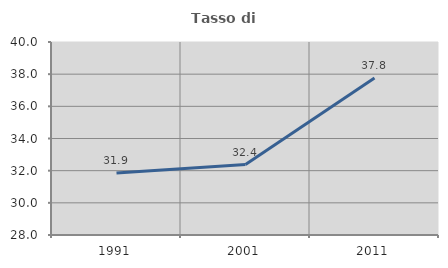
| Category | Tasso di occupazione   |
|---|---|
| 1991.0 | 31.86 |
| 2001.0 | 32.381 |
| 2011.0 | 37.757 |